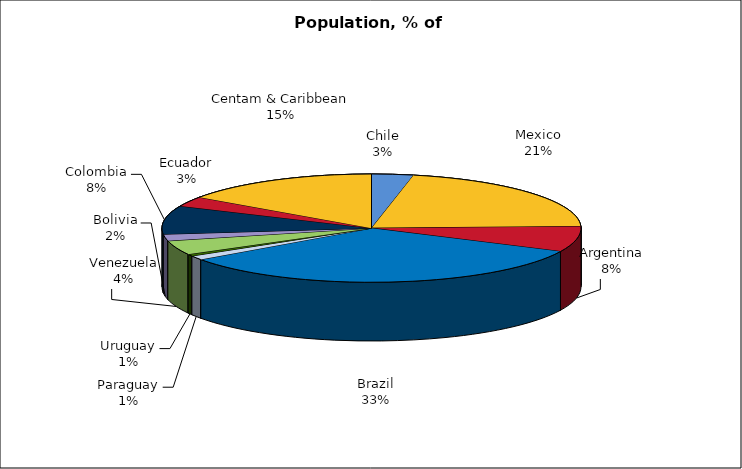
| Category | Series 0 |
|---|---|
| Chile | 20.086 |
| Mexico | 132.274 |
| Argentina | 47.164 |
| Brazil | 205.375 |
| Paraguay | 7.656 |
| Uruguay | 3.578 |
| Venezuela | 26.459 |
| Bolivia | 12.29 |
| Colombia | 52.691 |
| Ecuador | 18.516 |
| Centam & Caribbean | 95.291 |